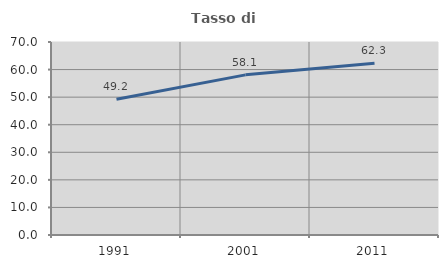
| Category | Tasso di occupazione   |
|---|---|
| 1991.0 | 49.211 |
| 2001.0 | 58.084 |
| 2011.0 | 62.266 |